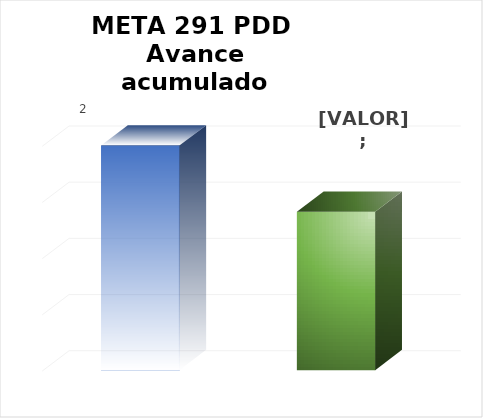
| Category | Meta PDD 2024 |
|---|---|
| 0 | 2 |
| 1 | 1.41 |